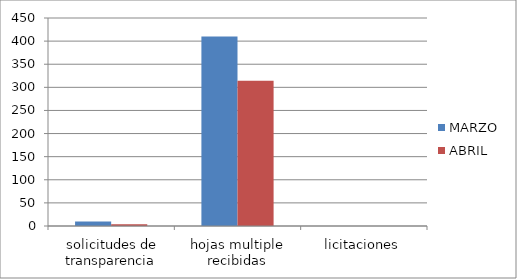
| Category | MARZO | ABRIL |
|---|---|---|
| solicitudes de transparencia | 10 | 4 |
| hojas multiple recibidas | 410 | 314 |
| licitaciones | 0 | 0 |